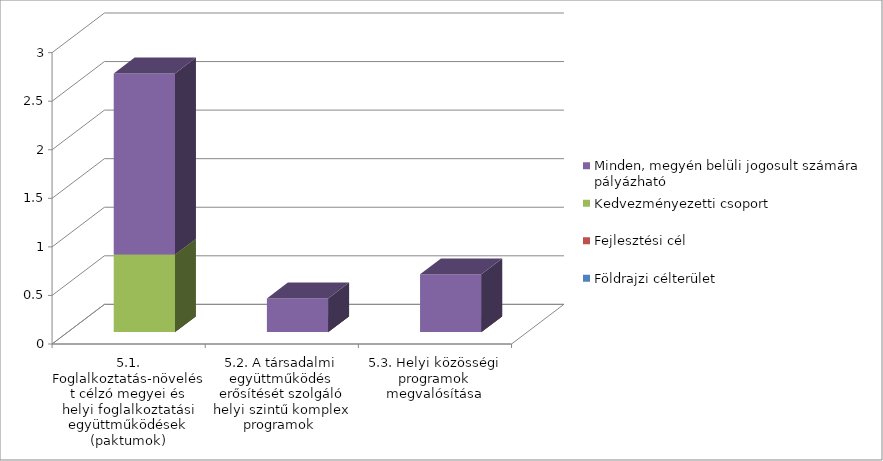
| Category | Földrajzi célterület  | Fejlesztési cél  | Kedvezményezetti csoport | Minden, megyén belüli jogosult számára pályázható   |
|---|---|---|---|---|
| 5.1. Foglalkoztatás-növelést célzó megyei és helyi foglalkoztatási együttműködések (paktumok) | 0 | 0 | 0.799 | 1.864 |
| 5.2. A társadalmi együttműködés erősítését szolgáló helyi szintű komplex programok  | 0 | 0 | 0 | 0.346 |
| 5.3. Helyi közösségi programok megvalósítása | 0 | 0 | 0 | 0.595 |